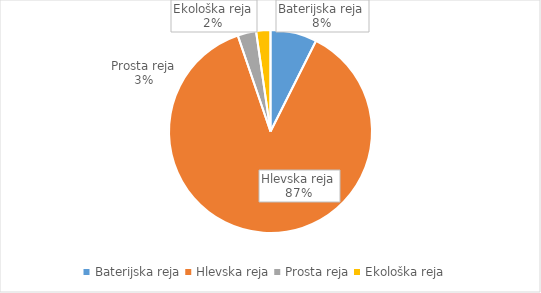
| Category | Količina kosov jajc |
|---|---|
| Baterijska reja | 223339 |
| Hlevska reja | 2635044 |
| Prosta reja | 88985 |
| Ekološka reja | 68720 |